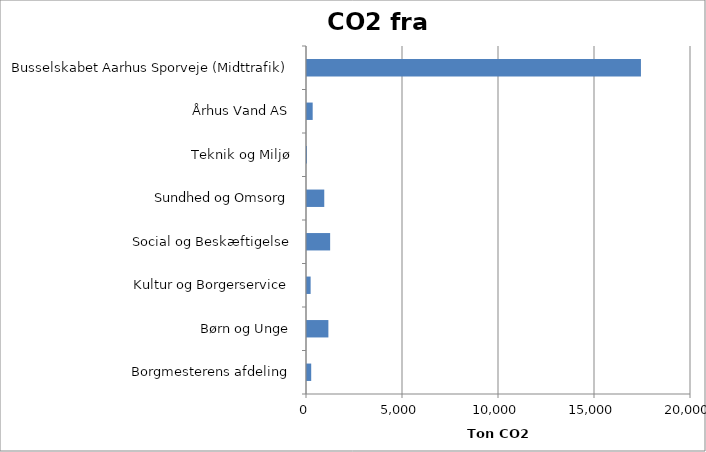
| Category | Ton CO2 |
|---|---|
| Borgmesterens afdeling | 219.07 |
| Børn og Unge | 1113.805 |
| Kultur og Borgerservice | 189.207 |
| Social og Beskæftigelse | 1205.418 |
| Sundhed og Omsorg | 899.012 |
| Teknik og Miljø | 0.061 |
| Århus Vand AS | 296.119 |
| Busselskabet Aarhus Sporveje (Midttrafik) | 17393.148 |